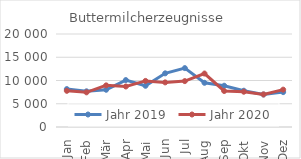
| Category | Jahr 2019 | Jahr 2020 |
|---|---|---|
| Jan | 8151.235 | 7780.694 |
| Feb | 7672.036 | 7455.872 |
| Mär | 8011.53 | 8953.184 |
| Apr | 10090.155 | 8714.64 |
| Mai | 8862.729 | 9909.019 |
| Jun | 11541.027 | 9594.876 |
| Jul | 12663.293 | 9869.605 |
| Aug | 9505.931 | 11500.312 |
| Sep | 8875.885 | 7743.631 |
| Okt | 7799.974 | 7586.509 |
| Nov | 6988.078 | 7008.979 |
| Dez | 7500.896 | 8031.592 |